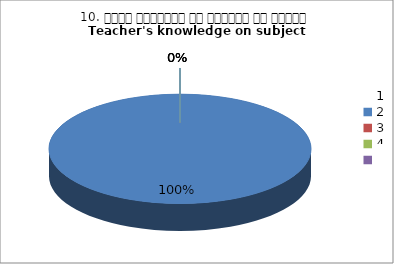
| Category | 10. विषय अवधारणा पर शिक्षक का ज्ञान
Teacher's knowledge on subject concept?
 |
|---|---|
| 0 | 1 |
| 1 | 0 |
| 2 | 0 |
| 3 | 0 |
| 4 | 0 |